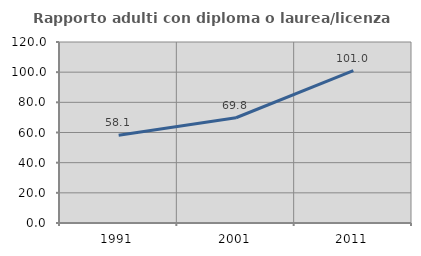
| Category | Rapporto adulti con diploma o laurea/licenza media  |
|---|---|
| 1991.0 | 58.12 |
| 2001.0 | 69.79 |
| 2011.0 | 100.962 |